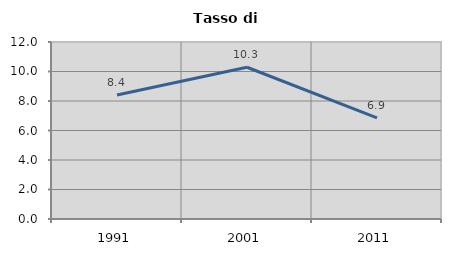
| Category | Tasso di disoccupazione   |
|---|---|
| 1991.0 | 8.403 |
| 2001.0 | 10.289 |
| 2011.0 | 6.859 |